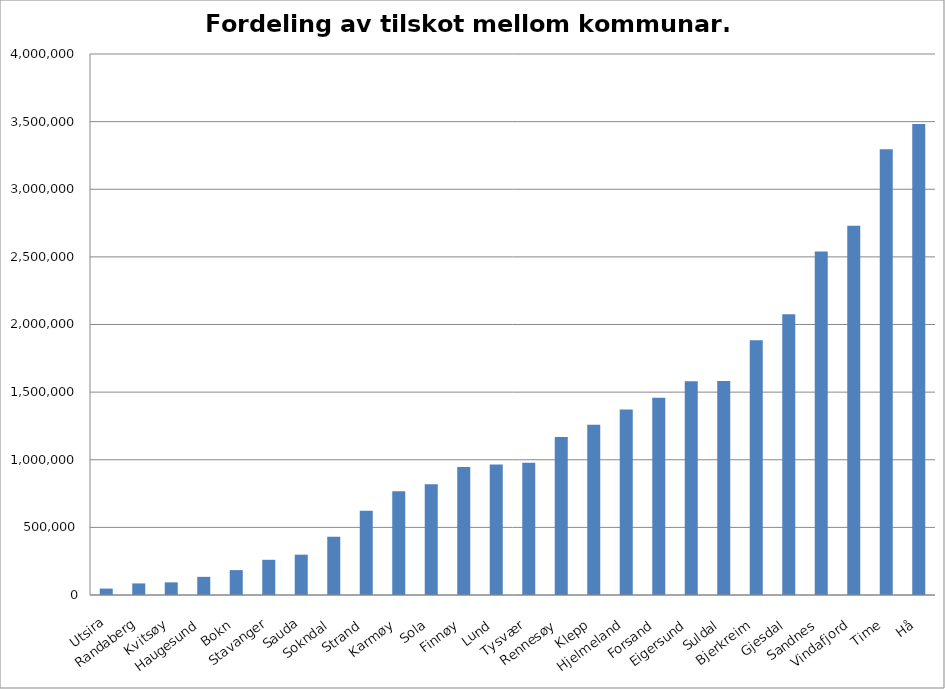
| Category | Series 0 |
|---|---|
| Utsira | 47450 |
| Randaberg | 85678 |
| Kvitsøy | 93473 |
| Haugesund | 134212 |
| Bokn | 184006 |
| Stavanger | 260223 |
| Sauda | 298233 |
| Sokndal | 430800 |
| Strand | 623268 |
| Karmøy | 766179 |
| Sola | 818547 |
| Finnøy | 946071 |
| Lund | 965107 |
| Tysvær | 977749 |
| Rennesøy | 1168674 |
| Klepp | 1258202 |
| Hjelmeland | 1371117 |
| Forsand | 1457526 |
| Eigersund | 1579828 |
| Suldal | 1582198 |
| Bjerkreim | 1884164 |
| Gjesdal | 2076273 |
| Sandnes | 2540373 |
| Vindafjord | 2730260 |
| Time | 3295379 |
| Hå | 3483334 |